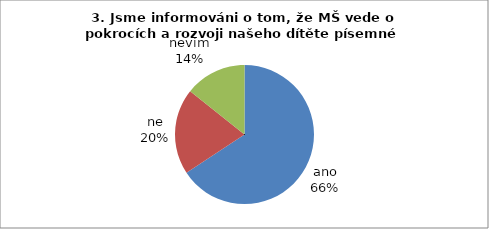
| Category | 3. Jsme informováni o tom, že MŠ vede o pokrocích a rozvoji našeho dítěte písemné záznamy. |
|---|---|
| ano | 23 |
| ne | 7 |
| nevím | 5 |